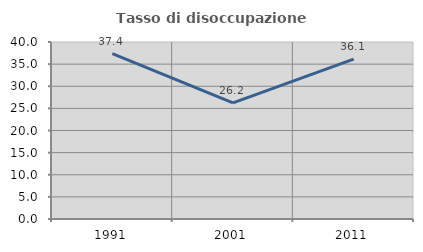
| Category | Tasso di disoccupazione giovanile  |
|---|---|
| 1991.0 | 37.363 |
| 2001.0 | 26.241 |
| 2011.0 | 36.145 |